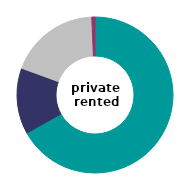
| Category | private 
rented |
|---|---|
| direct debit | 66.912 |
| standing order | 13.669 |
| pre-paid meter | 18.756 |
| other | 0.663 |